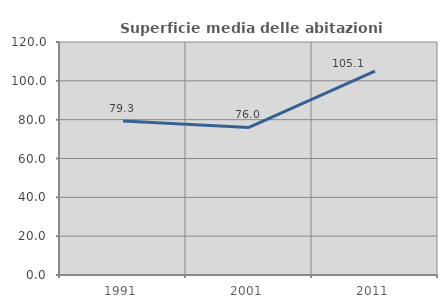
| Category | Superficie media delle abitazioni occupate |
|---|---|
| 1991.0 | 79.338 |
| 2001.0 | 75.99 |
| 2011.0 | 105.059 |